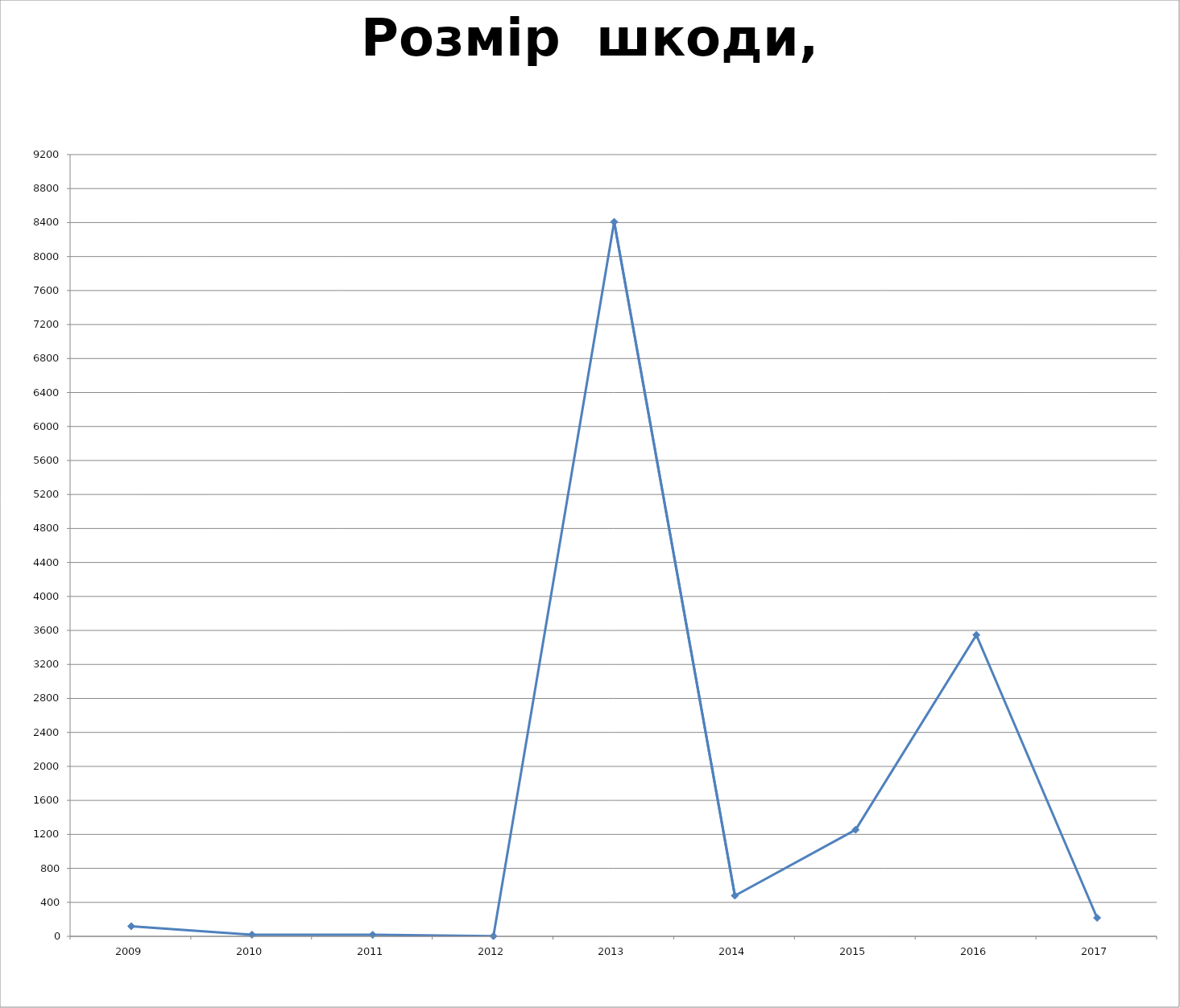
| Category | Розмір  шкоди, тис.грн |
|---|---|
| 2009.0 | 119 |
| 2010.0 | 19.4 |
| 2011.0 | 18 |
| 2012.0 | 3 |
| 2013.0 | 8408.3 |
| 2014.0 | 478.9 |
| 2015.0 | 1254.6 |
| 2016.0 | 3547.1 |
| 2017.0 | 217.7 |